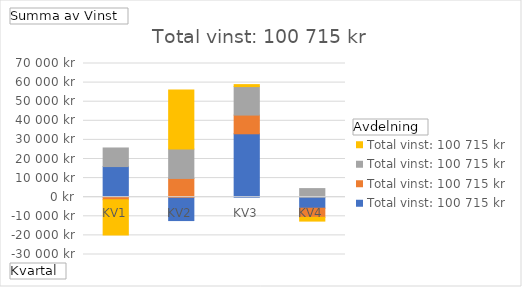
| Category | Norr | Syd | Väst | Öst |
|---|---|---|---|---|
| KV1 | 16034 | -1320 | 9738 | -18518 |
| KV2 | -12236 | 9825 | 15353 | 30901 |
| KV3 | 33202 | 9791 | 14919 | 1032 |
| KV4 | -5764 | -4753 | 4503 | -1992 |